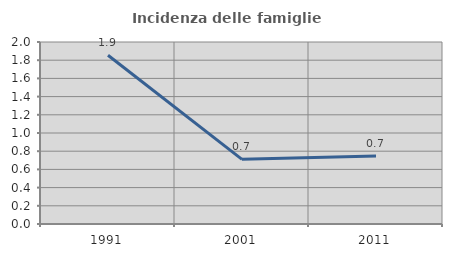
| Category | Incidenza delle famiglie numerose |
|---|---|
| 1991.0 | 1.854 |
| 2001.0 | 0.71 |
| 2011.0 | 0.747 |